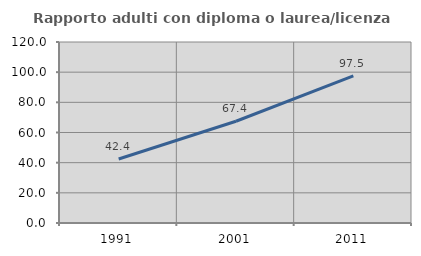
| Category | Rapporto adulti con diploma o laurea/licenza media  |
|---|---|
| 1991.0 | 42.405 |
| 2001.0 | 67.446 |
| 2011.0 | 97.517 |